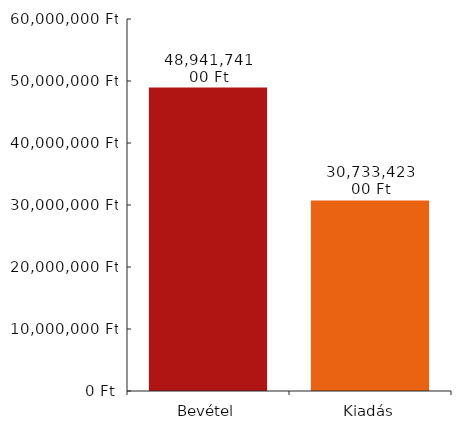
| Category | Diagramadatok |
|---|---|
| 0 | 48941741 |
| 1 | 30733423 |